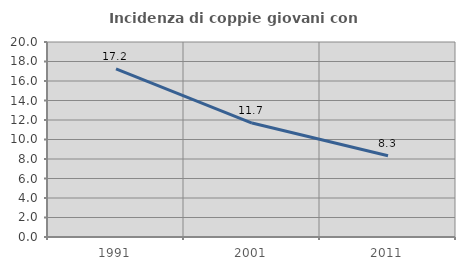
| Category | Incidenza di coppie giovani con figli |
|---|---|
| 1991.0 | 17.241 |
| 2001.0 | 11.688 |
| 2011.0 | 8.333 |